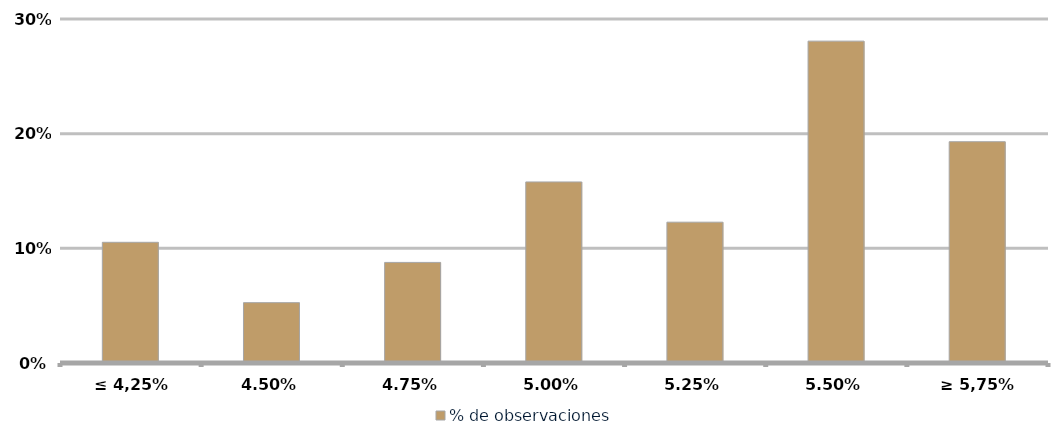
| Category | % de observaciones  |
|---|---|
| ≤ 4,25% | 0.105 |
| 4,50% | 0.053 |
| 4,75% | 0.088 |
| 5,00% | 0.158 |
| 5,25% | 0.123 |
| 5,50% | 0.281 |
| ≥ 5,75% | 0.193 |